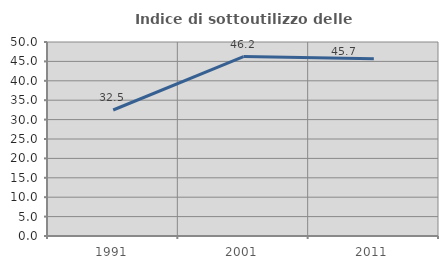
| Category | Indice di sottoutilizzo delle abitazioni  |
|---|---|
| 1991.0 | 32.472 |
| 2001.0 | 46.243 |
| 2011.0 | 45.683 |